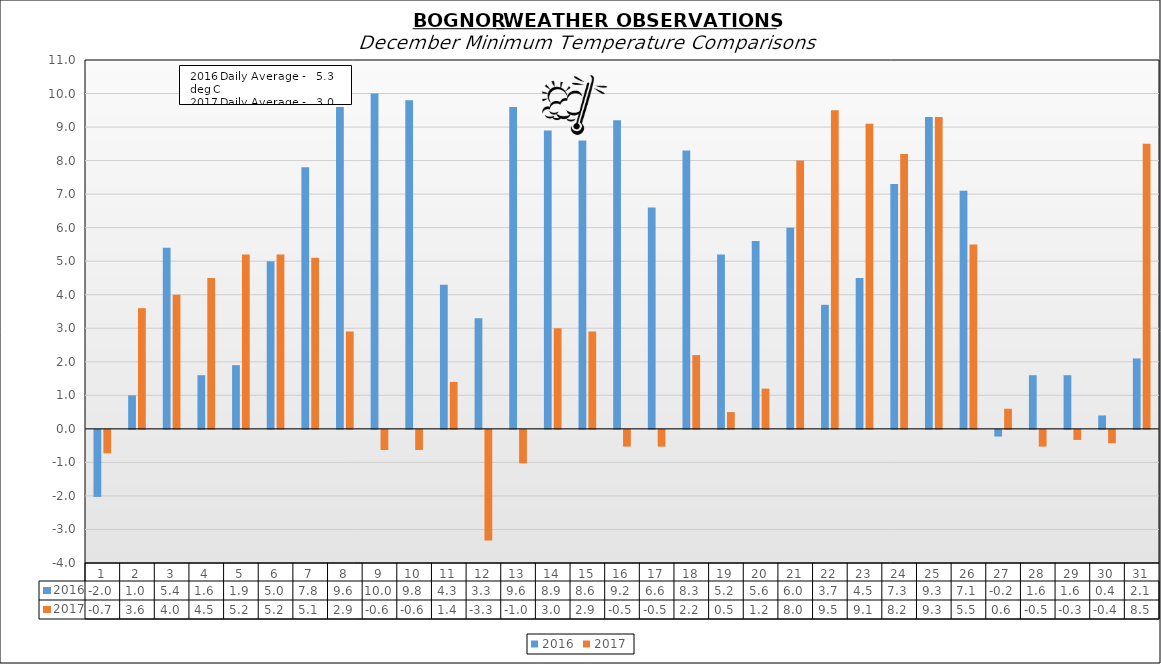
| Category | 2016 | 2017 |
|---|---|---|
| 0 | -2 | -0.7 |
| 1 | 1 | 3.6 |
| 2 | 5.4 | 4 |
| 3 | 1.6 | 4.5 |
| 4 | 1.9 | 5.2 |
| 5 | 5 | 5.2 |
| 6 | 7.8 | 5.1 |
| 7 | 9.6 | 2.9 |
| 8 | 10 | -0.6 |
| 9 | 9.8 | -0.6 |
| 10 | 4.3 | 1.4 |
| 11 | 3.3 | -3.3 |
| 12 | 9.6 | -1 |
| 13 | 8.9 | 3 |
| 14 | 8.6 | 2.9 |
| 15 | 9.2 | -0.5 |
| 16 | 6.6 | -0.5 |
| 17 | 8.3 | 2.2 |
| 18 | 5.2 | 0.5 |
| 19 | 5.6 | 1.2 |
| 20 | 6 | 8 |
| 21 | 3.7 | 9.5 |
| 22 | 4.5 | 9.1 |
| 23 | 7.3 | 8.2 |
| 24 | 9.3 | 9.3 |
| 25 | 7.1 | 5.5 |
| 26 | -0.2 | 0.6 |
| 27 | 1.6 | -0.5 |
| 28 | 1.6 | -0.3 |
| 29 | 0.4 | -0.4 |
| 30 | 2.1 | 8.5 |